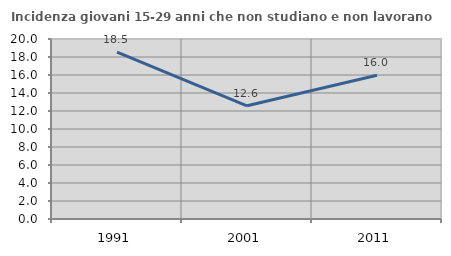
| Category | Incidenza giovani 15-29 anni che non studiano e non lavorano  |
|---|---|
| 1991.0 | 18.539 |
| 2001.0 | 12.581 |
| 2011.0 | 15.969 |